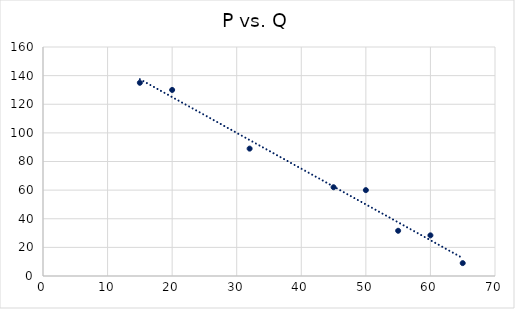
| Category | Series 0 |
|---|---|
| 15.0 | 135 |
| 20.0 | 130 |
| 32.0 | 89 |
| 45.0 | 62 |
| 50.0 | 60 |
| 55.0 | 31.6 |
| 60.0 | 28.4 |
| 65.0 | 9 |